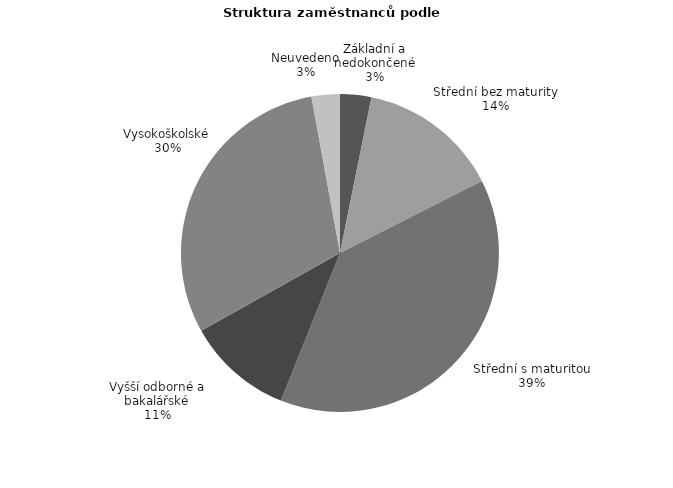
| Category | Series 0 |
|---|---|
| Základní a nedokončené | 19.945 |
| Střední bez maturity | 90.173 |
| Střední s maturitou | 242.024 |
| Vyšší odborné a bakalářské | 67.922 |
| Vysokoškolské | 189.937 |
| Neuvedeno | 18.088 |